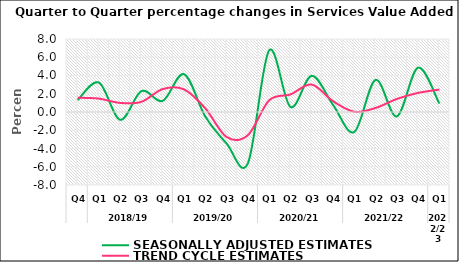
| Category | SEASONALLY ADJUSTED ESTIMATES | TREND CYCLE ESTIMATES |
|---|---|---|
| 0 | 1.299 | 1.561 |
| 1 | 3.228 | 1.467 |
| 2 | -0.856 | 0.995 |
| 3 | 2.294 | 1.116 |
| 4 | 1.219 | 2.516 |
| 5 | 4.145 | 2.479 |
| 6 | -0.498 | 0.399 |
| 7 | -3.449 | -2.737 |
| 8 | -5.631 | -2.543 |
| 9 | 6.755 | 1.276 |
| 10 | 0.556 | 1.926 |
| 11 | 3.963 | 3.011 |
| 12 | 0.796 | 1.191 |
| 13 | -2.193 | 0.028 |
| 14 | 3.512 | 0.442 |
| 15 | -0.482 | 1.428 |
| 16 | 4.857 | 2.093 |
| 17 | 0.924 | 2.456 |